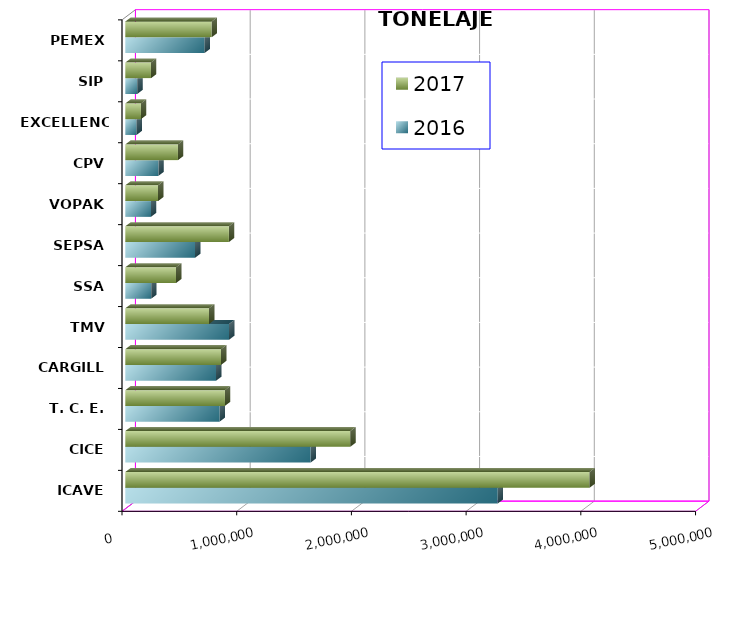
| Category | 2016 | 2017 |
|---|---|---|
| ICAVE | 3246589.4 | 4047157.622 |
| CICE | 1615676.518 | 1961021.779 |
| T. C. E. | 822586.409 | 868719.075 |
| CARGILL | 791681.651 | 834370.162 |
| TMV | 904879.955 | 730699.9 |
| SSA | 225380.578 | 442697.67 |
| SEPSA | 607684.324 | 903134.05 |
| VOPAK | 223787.874 | 285455.941 |
| CPV | 288782.206 | 458949.69 |
| EXCELLENCE | 98179.957 | 136191.447 |
| SIP | 104055.34 | 223527.15 |
| PEMEX | 691040.017 | 752626.932 |